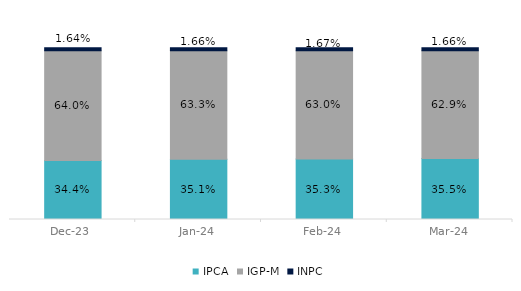
| Category | IPCA | IGP-M | INPC |
|---|---|---|---|
| 2023-12-01 | 0.344 | 0.64 | 0.016 |
| 2024-01-01 | 0.351 | 0.633 | 0.017 |
| 2024-02-01 | 0.353 | 0.63 | 0.017 |
| 2024-03-01 | 0.355 | 0.629 | 0.017 |